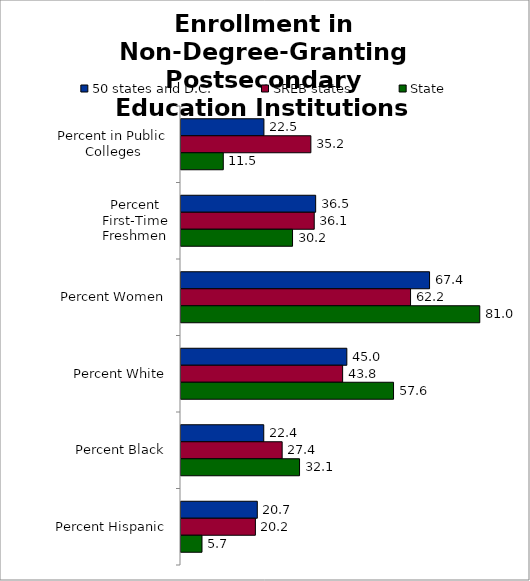
| Category | 50 states and D.C. | SREB states | State |
|---|---|---|---|
| 0 | 22.483 | 35.203 | 11.464 |
| 1 | 36.503 | 36.118 | 30.237 |
| 2 | 67.378 | 62.228 | 80.993 |
| 3 | 44.955 | 43.817 | 57.618 |
| 4 | 22.435 | 27.422 | 32.133 |
| 5 | 20.684 | 20.169 | 5.689 |